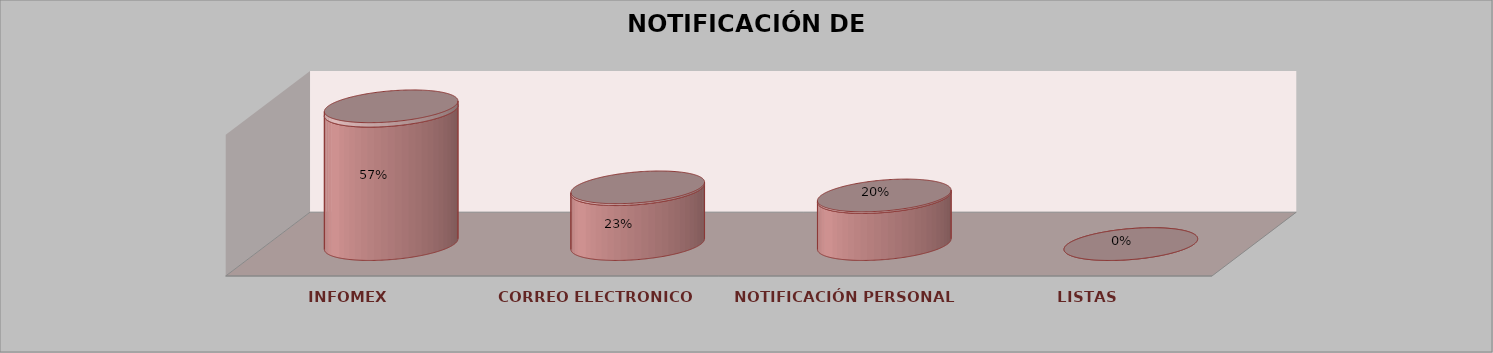
| Category | Series 0 | Series 1 | Series 2 | Series 3 | Series 4 |
|---|---|---|---|---|---|
| INFOMEX |  |  |  | 17 | 0.567 |
| CORREO ELECTRONICO |  |  |  | 7 | 0.233 |
| NOTIFICACIÓN PERSONAL |  |  |  | 6 | 0.2 |
| LISTAS |  |  |  | 0 | 0 |